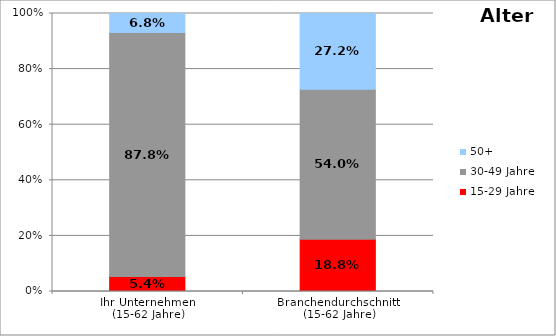
| Category | 15-29 Jahre | 30-49 Jahre | 50+ |
|---|---|---|---|
| Ihr Unternehmen 
(15-62 Jahre) | 0.054 | 0.878 | 0.068 |
| Branchendurchschnitt 
(15-62 Jahre) | 0.188 | 0.54 | 0.272 |